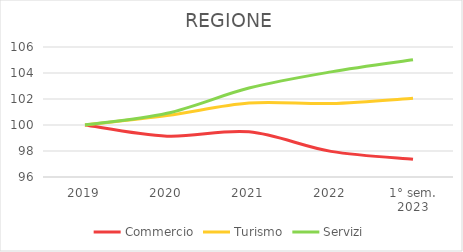
| Category | Commercio | Turismo | Servizi |
|---|---|---|---|
| 2019 | 100 | 100 | 100 |
| 2020 | 99.14 | 100.725 | 100.898 |
| 2021 | 99.474 | 101.694 | 102.841 |
| 2022 | 97.97 | 101.652 | 104.086 |
| 1° sem.
2023 | 97.363 | 102.057 | 105.011 |